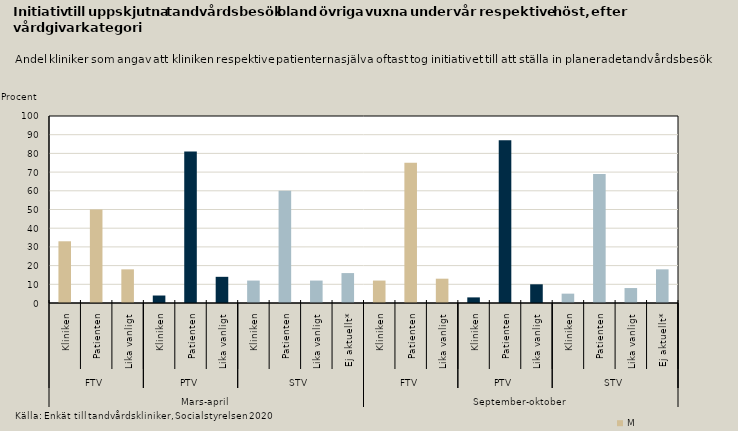
| Category | Övriga vuxna |
|---|---|
| 0 | 33 |
| 1 | 50 |
| 2 | 18 |
| 3 | 4 |
| 4 | 81 |
| 5 | 14 |
| 6 | 12 |
| 7 | 60 |
| 8 | 12 |
| 9 | 16 |
| 10 | 12 |
| 11 | 75 |
| 12 | 13 |
| 13 | 3 |
| 14 | 87 |
| 15 | 10 |
| 16 | 5 |
| 17 | 69 |
| 18 | 8 |
| 19 | 18 |